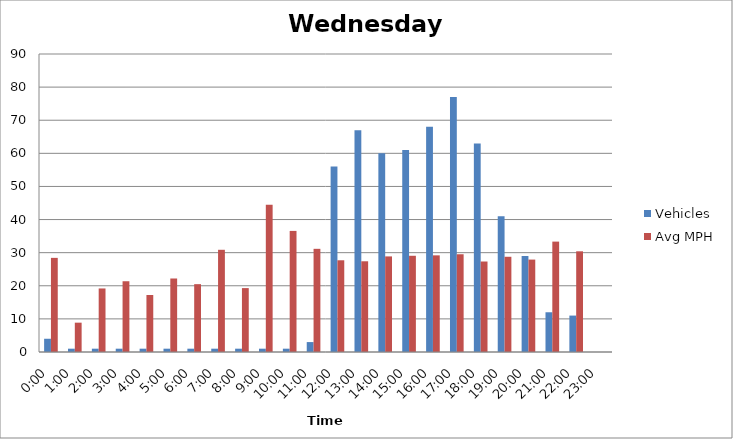
| Category | Vehicles | Avg MPH |
|---|---|---|
| 0:00 | 4 | 28.43 |
| 1:00 | 1 | 8.86 |
| 2:00 | 1 | 19.19 |
| 3:00 | 1 | 21.37 |
| 4:00 | 1 | 17.22 |
| 5:00 | 1 | 22.2 |
| 6:00 | 1 | 20.49 |
| 7:00 | 1 | 30.87 |
| 8:00 | 1 | 19.3 |
| 9:00 | 1 | 44.47 |
| 10:00 | 1 | 36.57 |
| 11:00 | 3 | 31.16 |
| 12:00 | 56 | 27.7 |
| 13:00 | 67 | 27.4 |
| 14:00 | 60 | 28.87 |
| 15:00 | 61 | 29.06 |
| 16:00 | 68 | 29.19 |
| 17:00 | 77 | 29.52 |
| 18:00 | 63 | 27.33 |
| 19:00 | 41 | 28.76 |
| 20:00 | 29 | 27.91 |
| 21:00 | 12 | 33.34 |
| 22:00 | 11 | 30.41 |
| 23:00 | 0 | 0 |